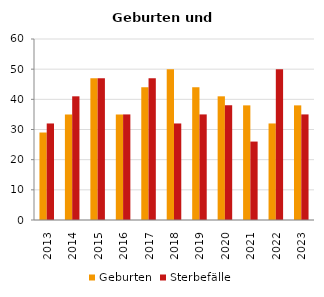
| Category | Geburten | Sterbefälle |
|---|---|---|
| 2013.0 | 29 | 32 |
| 2014.0 | 35 | 41 |
| 2015.0 | 47 | 47 |
| 2016.0 | 35 | 35 |
| 2017.0 | 44 | 47 |
| 2018.0 | 50 | 32 |
| 2019.0 | 44 | 35 |
| 2020.0 | 41 | 38 |
| 2021.0 | 38 | 26 |
| 2022.0 | 32 | 50 |
| 2023.0 | 38 | 35 |